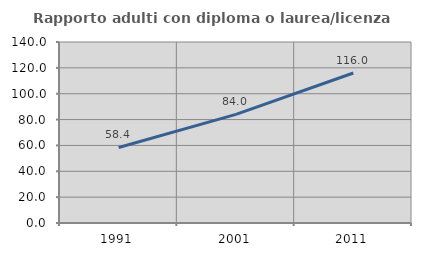
| Category | Rapporto adulti con diploma o laurea/licenza media  |
|---|---|
| 1991.0 | 58.407 |
| 2001.0 | 84.024 |
| 2011.0 | 116.022 |